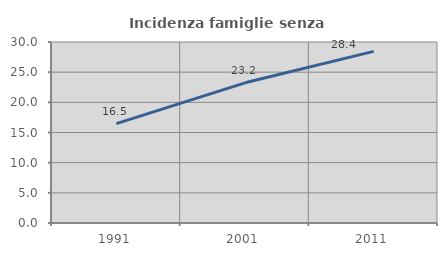
| Category | Incidenza famiglie senza nuclei |
|---|---|
| 1991.0 | 16.461 |
| 2001.0 | 23.236 |
| 2011.0 | 28.449 |